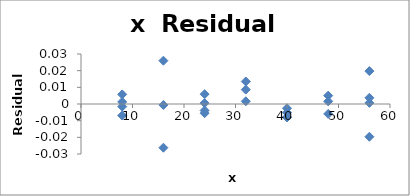
| Category | Series 0 |
|---|---|
| 8.0 | -0.007 |
| 8.0 | 0.006 |
| 8.0 | -0.002 |
| 8.0 | 0.001 |
| 16.0 | -0.026 |
| 16.0 | -0.001 |
| 16.0 | 0.026 |
| 24.0 | -0.006 |
| 24.0 | 0.001 |
| 24.0 | 0.006 |
| 24.0 | -0.004 |
| 32.0 | 0.002 |
| 32.0 | 0.009 |
| 32.0 | 0.014 |
| 40.0 | -0.005 |
| 40.0 | -0.003 |
| 40.0 | -0.008 |
| 40.0 | -0.008 |
| 48.0 | 0.005 |
| 48.0 | 0.002 |
| 48.0 | -0.006 |
| 56.0 | 0.001 |
| 56.0 | 0.02 |
| 56.0 | 0.004 |
| 56.0 | -0.02 |